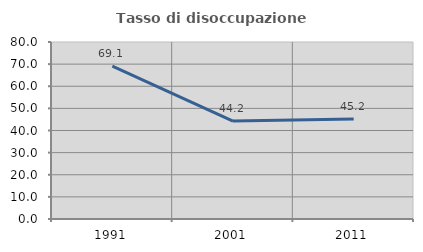
| Category | Tasso di disoccupazione giovanile  |
|---|---|
| 1991.0 | 69.087 |
| 2001.0 | 44.242 |
| 2011.0 | 45.161 |